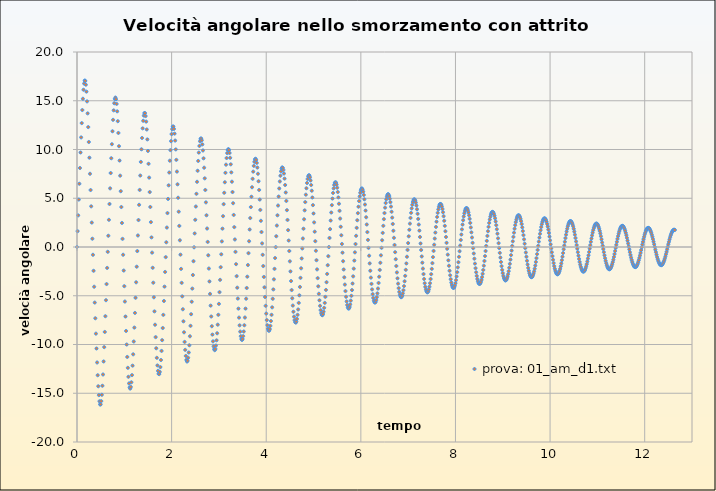
| Category | prova: 01_am_d1.txt |
|---|---|
| 0.0 | 0 |
| 0.0125 | 1.623 |
| 0.025 | 3.243 |
| 0.037500000000000006 | 4.865 |
| 0.05 | 6.487 |
| 0.0625 | 8.102 |
| 0.075 | 9.695 |
| 0.0875 | 11.242 |
| 0.09999999999999999 | 12.707 |
| 0.11249999999999999 | 14.046 |
| 0.12499999999999999 | 15.205 |
| 0.13749999999999998 | 16.129 |
| 0.15 | 16.766 |
| 0.1625 | 17.075 |
| 0.17500000000000002 | 17.036 |
| 0.18750000000000003 | 16.647 |
| 0.20000000000000004 | 15.934 |
| 0.21250000000000005 | 14.936 |
| 0.22500000000000006 | 13.705 |
| 0.23750000000000007 | 12.299 |
| 0.25000000000000006 | 10.769 |
| 0.26250000000000007 | 9.161 |
| 0.2750000000000001 | 7.51 |
| 0.2875000000000001 | 5.841 |
| 0.3000000000000001 | 4.17 |
| 0.3125000000000001 | 2.505 |
| 0.3250000000000001 | 0.849 |
| 0.33750000000000013 | -0.799 |
| 0.35000000000000014 | -2.441 |
| 0.36250000000000016 | -4.075 |
| 0.37500000000000017 | -5.701 |
| 0.3875000000000002 | -7.309 |
| 0.4000000000000002 | -8.887 |
| 0.4125000000000002 | -10.409 |
| 0.4250000000000002 | -11.844 |
| 0.4375000000000002 | -13.152 |
| 0.45000000000000023 | -14.284 |
| 0.46250000000000024 | -15.19 |
| 0.47500000000000026 | -15.824 |
| 0.48750000000000027 | -16.149 |
| 0.5000000000000002 | -16.144 |
| 0.5125000000000002 | -15.808 |
| 0.5250000000000001 | -15.159 |
| 0.5375000000000001 | -14.234 |
| 0.55 | -13.077 |
| 0.5625 | -11.74 |
| 0.575 | -10.27 |
| 0.5874999999999999 | -8.712 |
| 0.5999999999999999 | -7.099 |
| 0.6124999999999998 | -5.456 |
| 0.6249999999999998 | -3.801 |
| 0.6374999999999997 | -2.145 |
| 0.6499999999999997 | -0.493 |
| 0.6624999999999996 | 1.152 |
| 0.6749999999999996 | 2.788 |
| 0.6874999999999996 | 4.411 |
| 0.6999999999999995 | 6.014 |
| 0.7124999999999995 | 7.585 |
| 0.7249999999999994 | 9.104 |
| 0.7374999999999994 | 10.544 |
| 0.7499999999999993 | 11.871 |
| 0.7624999999999993 | 13.042 |
| 0.7749999999999992 | 14.015 |
| 0.7874999999999992 | 14.743 |
| 0.7999999999999992 | 15.19 |
| 0.8124999999999991 | 15.331 |
| 0.8249999999999991 | 15.156 |
| 0.837499999999999 | 14.675 |
| 0.849999999999999 | 13.912 |
| 0.8624999999999989 | 12.905 |
| 0.8749999999999989 | 11.698 |
| 0.8874999999999988 | 10.337 |
| 0.8999999999999988 | 8.865 |
| 0.9124999999999988 | 7.316 |
| 0.9249999999999987 | 5.721 |
| 0.9374999999999987 | 4.1 |
| 0.9499999999999986 | 2.468 |
| 0.9624999999999986 | 0.834 |
| 0.9749999999999985 | -0.796 |
| 0.9874999999999985 | -2.415 |
| 0.9999999999999984 | -4.018 |
| 1.0124999999999984 | -5.594 |
| 1.0249999999999984 | -7.132 |
| 1.0374999999999983 | -8.61 |
| 1.0499999999999983 | -10.003 |
| 1.0624999999999982 | -11.277 |
| 1.0749999999999982 | -12.394 |
| 1.0874999999999981 | -13.313 |
| 1.099999999999998 | -13.994 |
| 1.112499999999998 | -14.406 |
| 1.124999999999998 | -14.526 |
| 1.137499999999998 | -14.346 |
| 1.149999999999998 | -13.877 |
| 1.1624999999999979 | -13.14 |
| 1.1749999999999978 | -12.17 |
| 1.1874999999999978 | -11.008 |
| 1.1999999999999977 | -9.694 |
| 1.2124999999999977 | -8.267 |
| 1.2249999999999976 | -6.763 |
| 1.2374999999999976 | -5.207 |
| 1.2499999999999976 | -3.621 |
| 1.2624999999999975 | -2.021 |
| 1.2749999999999975 | -0.418 |
| 1.2874999999999974 | 1.181 |
| 1.2999999999999974 | 2.766 |
| 1.3124999999999973 | 4.327 |
| 1.3249999999999973 | 5.854 |
| 1.3374999999999972 | 7.328 |
| 1.3499999999999972 | 8.727 |
| 1.3624999999999972 | 10.023 |
| 1.3749999999999971 | 11.183 |
| 1.387499999999997 | 12.169 |
| 1.399999999999997 | 12.945 |
| 1.412499999999997 | 13.478 |
| 1.424999999999997 | 13.743 |
| 1.437499999999997 | 13.726 |
| 1.4499999999999968 | 13.427 |
| 1.4624999999999968 | 12.861 |
| 1.4749999999999968 | 12.053 |
| 1.4874999999999967 | 11.037 |
| 1.4999999999999967 | 9.852 |
| 1.5124999999999966 | 8.533 |
| 1.5249999999999966 | 7.118 |
| 1.5374999999999965 | 5.633 |
| 1.5499999999999965 | 4.105 |
| 1.5624999999999964 | 2.551 |
| 1.5749999999999964 | 0.987 |
| 1.5874999999999964 | -0.578 |
| 1.5999999999999963 | -2.131 |
| 1.6124999999999963 | -3.662 |
| 1.6249999999999962 | -5.157 |
| 1.6374999999999962 | -6.601 |
| 1.6499999999999961 | -7.972 |
| 1.662499999999996 | -9.244 |
| 1.674999999999996 | -10.386 |
| 1.687499999999996 | -11.365 |
| 1.699999999999996 | -12.147 |
| 1.712499999999996 | -12.701 |
| 1.7249999999999959 | -13.003 |
| 1.7374999999999958 | -13.039 |
| 1.7499999999999958 | -12.807 |
| 1.7624999999999957 | -12.318 |
| 1.7749999999999957 | -11.592 |
| 1.7874999999999956 | -10.659 |
| 1.7999999999999956 | -9.553 |
| 1.8124999999999956 | -8.31 |
| 1.8249999999999955 | -6.962 |
| 1.8374999999999955 | -5.539 |
| 1.8499999999999954 | -4.064 |
| 1.8624999999999954 | -2.559 |
| 1.8749999999999953 | -1.039 |
| 1.8874999999999953 | 0.483 |
| 1.8999999999999952 | 1.993 |
| 1.9124999999999952 | 3.481 |
| 1.9249999999999952 | 4.93 |
| 1.9374999999999951 | 6.323 |
| 1.949999999999995 | 7.639 |
| 1.962499999999995 | 8.853 |
| 1.974999999999995 | 9.935 |
| 1.987499999999995 | 10.854 |
| 1.999999999999995 | 11.579 |
| 2.012499999999995 | 12.084 |
| 2.024999999999995 | 12.348 |
| 2.037499999999995 | 12.358 |
| 2.0499999999999954 | 12.114 |
| 2.0624999999999956 | 11.626 |
| 2.0749999999999957 | 10.916 |
| 2.087499999999996 | 10.009 |
| 2.099999999999996 | 8.938 |
| 2.1124999999999963 | 7.735 |
| 2.1249999999999964 | 6.43 |
| 2.1374999999999966 | 5.051 |
| 2.149999999999997 | 3.622 |
| 2.162499999999997 | 2.162 |
| 2.174999999999997 | 0.688 |
| 2.1874999999999973 | -0.786 |
| 2.1999999999999975 | -2.245 |
| 2.2124999999999977 | -3.676 |
| 2.224999999999998 | -5.063 |
| 2.237499999999998 | -6.386 |
| 2.2499999999999982 | -7.622 |
| 2.2624999999999984 | -8.748 |
| 2.2749999999999986 | -9.734 |
| 2.2874999999999988 | -10.551 |
| 2.299999999999999 | -11.173 |
| 2.312499999999999 | -11.577 |
| 2.3249999999999993 | -11.745 |
| 2.3374999999999995 | -11.672 |
| 2.3499999999999996 | -11.36 |
| 2.3625 | -10.822 |
| 2.375 | -10.079 |
| 2.3875 | -9.157 |
| 2.4000000000000004 | -8.086 |
| 2.4125000000000005 | -6.895 |
| 2.4250000000000007 | -5.614 |
| 2.437500000000001 | -4.266 |
| 2.450000000000001 | -2.874 |
| 2.4625000000000012 | -1.456 |
| 2.4750000000000014 | -0.03 |
| 2.4875000000000016 | 1.39 |
| 2.5000000000000018 | 2.789 |
| 2.512500000000002 | 4.15 |
| 2.525000000000002 | 5.456 |
| 2.5375000000000023 | 6.687 |
| 2.5500000000000025 | 7.819 |
| 2.5625000000000027 | 8.826 |
| 2.575000000000003 | 9.683 |
| 2.587500000000003 | 10.362 |
| 2.600000000000003 | 10.841 |
| 2.6125000000000034 | 11.102 |
| 2.6250000000000036 | 11.135 |
| 2.6375000000000037 | 10.94 |
| 2.650000000000004 | 10.523 |
| 2.662500000000004 | 9.901 |
| 2.6750000000000043 | 9.095 |
| 2.6875000000000044 | 8.133 |
| 2.7000000000000046 | 7.041 |
| 2.712500000000005 | 5.847 |
| 2.725000000000005 | 4.577 |
| 2.737500000000005 | 3.253 |
| 2.7500000000000053 | 1.895 |
| 2.7625000000000055 | 0.522 |
| 2.7750000000000057 | -0.852 |
| 2.787500000000006 | -2.209 |
| 2.800000000000006 | -3.533 |
| 2.812500000000006 | -4.808 |
| 2.8250000000000064 | -6.014 |
| 2.8375000000000066 | -7.128 |
| 2.8500000000000068 | -8.126 |
| 2.862500000000007 | -8.985 |
| 2.875000000000007 | -9.679 |
| 2.8875000000000073 | -10.188 |
| 2.9000000000000075 | -10.492 |
| 2.9125000000000076 | -10.582 |
| 2.925000000000008 | -10.453 |
| 2.937500000000008 | -10.112 |
| 2.950000000000008 | -9.571 |
| 2.9625000000000083 | -8.848 |
| 2.9750000000000085 | -7.967 |
| 2.9875000000000087 | -6.954 |
| 3.000000000000009 | -5.834 |
| 3.012500000000009 | -4.632 |
| 3.0250000000000092 | -3.371 |
| 3.0375000000000094 | -2.071 |
| 3.0500000000000096 | -0.751 |
| 3.0625000000000098 | 0.572 |
| 3.07500000000001 | 1.882 |
| 3.08750000000001 | 3.162 |
| 3.1000000000000103 | 4.395 |
| 3.1125000000000105 | 5.561 |
| 3.1250000000000107 | 6.64 |
| 3.137500000000011 | 7.609 |
| 3.150000000000011 | 8.444 |
| 3.162500000000011 | 9.124 |
| 3.1750000000000114 | 9.628 |
| 3.1875000000000115 | 9.938 |
| 3.2000000000000117 | 10.046 |
| 3.212500000000012 | 9.946 |
| 3.225000000000012 | 9.643 |
| 3.2375000000000123 | 9.148 |
| 3.2500000000000124 | 8.478 |
| 3.2625000000000126 | 7.653 |
| 3.275000000000013 | 6.698 |
| 3.287500000000013 | 5.636 |
| 3.300000000000013 | 4.491 |
| 3.3125000000000133 | 3.286 |
| 3.3250000000000135 | 2.04 |
| 3.3375000000000137 | 0.772 |
| 3.350000000000014 | -0.499 |
| 3.362500000000014 | -1.759 |
| 3.375000000000014 | -2.989 |
| 3.3875000000000144 | -4.172 |
| 3.4000000000000146 | -5.289 |
| 3.4125000000000147 | -6.319 |
| 3.425000000000015 | -7.242 |
| 3.437500000000015 | -8.036 |
| 3.4500000000000153 | -8.679 |
| 3.4625000000000155 | -9.152 |
| 3.4750000000000156 | -9.442 |
| 3.487500000000016 | -9.538 |
| 3.500000000000016 | -9.437 |
| 3.512500000000016 | -9.144 |
| 3.5250000000000163 | -8.668 |
| 3.5375000000000165 | -8.025 |
| 3.5500000000000167 | -7.235 |
| 3.562500000000017 | -6.32 |
| 3.575000000000017 | -5.301 |
| 3.5875000000000172 | -4.203 |
| 3.6000000000000174 | -3.045 |
| 3.6125000000000176 | -1.849 |
| 3.6250000000000178 | -0.632 |
| 3.637500000000018 | 0.589 |
| 3.650000000000018 | 1.795 |
| 3.6625000000000183 | 2.971 |
| 3.6750000000000185 | 4.098 |
| 3.6875000000000187 | 5.157 |
| 3.700000000000019 | 6.129 |
| 3.712500000000019 | 6.993 |
| 3.725000000000019 | 7.73 |
| 3.7375000000000194 | 8.318 |
| 3.7500000000000195 | 8.743 |
| 3.7625000000000197 | 8.991 |
| 3.77500000000002 | 9.054 |
| 3.78750000000002 | 8.93 |
| 3.8000000000000203 | 8.625 |
| 3.8125000000000204 | 8.147 |
| 3.8250000000000206 | 7.513 |
| 3.837500000000021 | 6.741 |
| 3.850000000000021 | 5.85 |
| 3.862500000000021 | 4.864 |
| 3.8750000000000213 | 3.803 |
| 3.8875000000000215 | 2.687 |
| 3.9000000000000217 | 1.536 |
| 3.912500000000022 | 0.367 |
| 3.925000000000022 | -0.801 |
| 3.937500000000022 | -1.953 |
| 3.9500000000000224 | -3.07 |
| 3.9625000000000226 | -4.135 |
| 3.9750000000000227 | -5.129 |
| 3.987500000000023 | -6.034 |
| 4.000000000000023 | -6.83 |
| 4.012500000000023 | -7.497 |
| 4.0250000000000234 | -8.018 |
| 4.037500000000024 | -8.38 |
| 4.050000000000024 | -8.571 |
| 4.062500000000024 | -8.585 |
| 4.075000000000024 | -8.422 |
| 4.087500000000024 | -8.089 |
| 4.1000000000000245 | -7.595 |
| 4.112500000000025 | -6.955 |
| 4.125000000000025 | -6.188 |
| 4.137500000000025 | -5.313 |
| 4.150000000000025 | -4.35 |
| 4.162500000000025 | -3.319 |
| 4.175000000000026 | -2.24 |
| 4.187500000000026 | -1.132 |
| 4.200000000000026 | -0.011 |
| 4.212500000000026 | 1.105 |
| 4.225000000000026 | 2.199 |
| 4.2375000000000265 | 3.253 |
| 4.250000000000027 | 4.251 |
| 4.262500000000027 | 5.174 |
| 4.275000000000027 | 6.003 |
| 4.287500000000027 | 6.721 |
| 4.300000000000027 | 7.31 |
| 4.3125000000000275 | 7.754 |
| 4.325000000000028 | 8.041 |
| 4.337500000000028 | 8.164 |
| 4.350000000000028 | 8.118 |
| 4.362500000000028 | 7.906 |
| 4.375000000000028 | 7.534 |
| 4.387500000000029 | 7.014 |
| 4.400000000000029 | 6.36 |
| 4.412500000000029 | 5.59 |
| 4.425000000000029 | 4.723 |
| 4.437500000000029 | 3.778 |
| 4.4500000000000295 | 2.774 |
| 4.46250000000003 | 1.73 |
| 4.47500000000003 | 0.663 |
| 4.48750000000003 | -0.41 |
| 4.50000000000003 | -1.471 |
| 4.51250000000003 | -2.504 |
| 4.5250000000000306 | -3.491 |
| 4.537500000000031 | -4.417 |
| 4.550000000000031 | -5.261 |
| 4.562500000000031 | -6.009 |
| 4.575000000000031 | -6.641 |
| 4.587500000000031 | -7.143 |
| 4.600000000000032 | -7.502 |
| 4.612500000000032 | -7.708 |
| 4.625000000000032 | -7.755 |
| 4.637500000000032 | -7.642 |
| 4.650000000000032 | -7.374 |
| 4.6625000000000325 | -6.957 |
| 4.675000000000033 | -6.405 |
| 4.687500000000033 | -5.733 |
| 4.700000000000033 | -4.956 |
| 4.712500000000033 | -4.094 |
| 4.725000000000033 | -3.165 |
| 4.737500000000034 | -2.186 |
| 4.750000000000034 | -1.176 |
| 4.762500000000034 | -0.151 |
| 4.775000000000034 | 0.871 |
| 4.787500000000034 | 1.875 |
| 4.8000000000000345 | 2.843 |
| 4.812500000000035 | 3.759 |
| 4.825000000000035 | 4.606 |
| 4.837500000000035 | 5.367 |
| 4.850000000000035 | 6.025 |
| 4.862500000000035 | 6.566 |
| 4.8750000000000355 | 6.976 |
| 4.887500000000036 | 7.244 |
| 4.900000000000036 | 7.364 |
| 4.912500000000036 | 7.331 |
| 4.925000000000036 | 7.148 |
| 4.937500000000036 | 6.82 |
| 4.950000000000037 | 6.357 |
| 4.962500000000037 | 5.772 |
| 4.975000000000037 | 5.078 |
| 4.987500000000037 | 4.294 |
| 5.000000000000037 | 3.437 |
| 5.0125000000000375 | 2.523 |
| 5.025000000000038 | 1.57 |
| 5.037500000000038 | 0.596 |
| 5.050000000000038 | -0.384 |
| 5.062500000000038 | -1.353 |
| 5.075000000000038 | -2.295 |
| 5.0875000000000385 | -3.194 |
| 5.100000000000039 | -4.033 |
| 5.112500000000039 | -4.796 |
| 5.125000000000039 | -5.467 |
| 5.137500000000039 | -6.032 |
| 5.150000000000039 | -6.476 |
| 5.16250000000004 | -6.79 |
| 5.17500000000004 | -6.964 |
| 5.18750000000004 | -6.995 |
| 5.20000000000004 | -6.882 |
| 5.21250000000004 | -6.628 |
| 5.2250000000000405 | -6.242 |
| 5.237500000000041 | -5.733 |
| 5.250000000000041 | -5.114 |
| 5.262500000000041 | -4.402 |
| 5.275000000000041 | -3.612 |
| 5.287500000000041 | -2.761 |
| 5.300000000000042 | -1.865 |
| 5.312500000000042 | -0.941 |
| 5.325000000000042 | -0.005 |
| 5.337500000000042 | 0.926 |
| 5.350000000000042 | 1.837 |
| 5.3625000000000425 | 2.713 |
| 5.375000000000043 | 3.537 |
| 5.387500000000043 | 4.293 |
| 5.400000000000043 | 4.967 |
| 5.412500000000043 | 5.544 |
| 5.425000000000043 | 6.011 |
| 5.4375000000000435 | 6.356 |
| 5.450000000000044 | 6.571 |
| 5.462500000000044 | 6.651 |
| 5.475000000000044 | 6.594 |
| 5.487500000000044 | 6.401 |
| 5.500000000000044 | 6.079 |
| 5.512500000000045 | 5.637 |
| 5.525000000000045 | 5.085 |
| 5.537500000000045 | 4.438 |
| 5.550000000000045 | 3.71 |
| 5.562500000000045 | 2.918 |
| 5.5750000000000455 | 2.077 |
| 5.587500000000046 | 1.203 |
| 5.600000000000046 | 0.312 |
| 5.612500000000046 | -0.58 |
| 5.625000000000046 | -1.458 |
| 5.637500000000046 | -2.306 |
| 5.6500000000000465 | -3.11 |
| 5.662500000000047 | -3.854 |
| 5.675000000000047 | -4.523 |
| 5.687500000000047 | -5.103 |
| 5.700000000000047 | -5.582 |
| 5.712500000000047 | -5.948 |
| 5.725000000000048 | -6.192 |
| 5.737500000000048 | -6.309 |
| 5.750000000000048 | -6.296 |
| 5.762500000000048 | -6.153 |
| 5.775000000000048 | -5.886 |
| 5.7875000000000485 | -5.5 |
| 5.800000000000049 | -5.007 |
| 5.812500000000049 | -4.418 |
| 5.825000000000049 | -3.748 |
| 5.837500000000049 | -3.01 |
| 5.850000000000049 | -2.221 |
| 5.86250000000005 | -1.395 |
| 5.87500000000005 | -0.549 |
| 5.88750000000005 | 0.304 |
| 5.90000000000005 | 1.147 |
| 5.91250000000005 | 1.966 |
| 5.9250000000000504 | 2.746 |
| 5.937500000000051 | 3.472 |
| 5.950000000000051 | 4.13 |
| 5.962500000000051 | 4.707 |
| 5.975000000000051 | 5.19 |
| 5.987500000000051 | 5.568 |
| 6.0000000000000515 | 5.832 |
| 6.012500000000052 | 5.977 |
| 6.025000000000052 | 5.998 |
| 6.037500000000052 | 5.895 |
| 6.050000000000052 | 5.672 |
| 6.062500000000052 | 5.335 |
| 6.075000000000053 | 4.893 |
| 6.087500000000053 | 4.356 |
| 6.100000000000053 | 3.737 |
| 6.112500000000053 | 3.05 |
| 6.125000000000053 | 2.309 |
| 6.1375000000000535 | 1.53 |
| 6.150000000000054 | 0.726 |
| 6.162500000000054 | -0.087 |
| 6.175000000000054 | -0.894 |
| 6.187500000000054 | -1.682 |
| 6.200000000000054 | -2.436 |
| 6.2125000000000545 | -3.141 |
| 6.225000000000055 | -3.784 |
| 6.237500000000055 | -4.353 |
| 6.250000000000055 | -4.834 |
| 6.262500000000055 | -5.217 |
| 6.275000000000055 | -5.494 |
| 6.287500000000056 | -5.658 |
| 6.300000000000056 | -5.705 |
| 6.312500000000056 | -5.634 |
| 6.325000000000056 | -5.448 |
| 6.337500000000056 | -5.152 |
| 6.3500000000000565 | -4.753 |
| 6.362500000000057 | -4.262 |
| 6.375000000000057 | -3.689 |
| 6.387500000000057 | -3.049 |
| 6.400000000000057 | -2.353 |
| 6.412500000000057 | -1.618 |
| 6.4250000000000576 | -0.855 |
| 6.437500000000058 | -0.081 |
| 6.450000000000058 | 0.691 |
| 6.462500000000058 | 1.447 |
| 6.475000000000058 | 2.173 |
| 6.487500000000058 | 2.855 |
| 6.500000000000059 | 3.481 |
| 6.512500000000059 | 4.037 |
| 6.525000000000059 | 4.512 |
| 6.537500000000059 | 4.895 |
| 6.550000000000059 | 5.178 |
| 6.5625000000000595 | 5.355 |
| 6.57500000000006 | 5.421 |
| 6.58750000000006 | 5.375 |
| 6.60000000000006 | 5.219 |
| 6.61250000000006 | 4.957 |
| 6.62500000000006 | 4.596 |
| 6.637500000000061 | 4.145 |
| 6.650000000000061 | 3.614 |
| 6.662500000000061 | 3.015 |
| 6.675000000000061 | 2.362 |
| 6.687500000000061 | 1.667 |
| 6.7000000000000615 | 0.944 |
| 6.712500000000062 | 0.207 |
| 6.725000000000062 | -0.53 |
| 6.737500000000062 | -1.254 |
| 6.750000000000062 | -1.952 |
| 6.762500000000062 | -2.609 |
| 6.7750000000000625 | -3.215 |
| 6.787500000000063 | -3.755 |
| 6.800000000000063 | -4.22 |
| 6.812500000000063 | -4.599 |
| 6.825000000000063 | -4.884 |
| 6.837500000000063 | -5.069 |
| 6.850000000000064 | -5.148 |
| 6.862500000000064 | -5.122 |
| 6.875000000000064 | -4.99 |
| 6.887500000000064 | -4.757 |
| 6.900000000000064 | -4.428 |
| 6.9125000000000645 | -4.012 |
| 6.925000000000065 | -3.518 |
| 6.937500000000065 | -2.957 |
| 6.950000000000065 | -2.342 |
| 6.962500000000065 | -1.686 |
| 6.975000000000065 | -1 |
| 6.9875000000000655 | -0.299 |
| 7.000000000000066 | 0.404 |
| 7.012500000000066 | 1.097 |
| 7.025000000000066 | 1.765 |
| 7.037500000000066 | 2.398 |
| 7.050000000000066 | 2.981 |
| 7.062500000000067 | 3.505 |
| 7.075000000000067 | 3.957 |
| 7.087500000000067 | 4.329 |
| 7.100000000000067 | 4.612 |
| 7.112500000000067 | 4.8 |
| 7.1250000000000675 | 4.888 |
| 7.137500000000068 | 4.876 |
| 7.150000000000068 | 4.764 |
| 7.162500000000068 | 4.554 |
| 7.175000000000068 | 4.253 |
| 7.187500000000068 | 3.867 |
| 7.200000000000069 | 3.406 |
| 7.212500000000069 | 2.88 |
| 7.225000000000069 | 2.301 |
| 7.237500000000069 | 1.68 |
| 7.250000000000069 | 1.03 |
| 7.2625000000000695 | 0.363 |
| 7.27500000000007 | -0.307 |
| 7.28750000000007 | -0.969 |
| 7.30000000000007 | -1.609 |
| 7.31250000000007 | -2.215 |
| 7.32500000000007 | -2.777 |
| 7.3375000000000705 | -3.281 |
| 7.350000000000071 | -3.719 |
| 7.362500000000071 | -4.081 |
| 7.375000000000071 | -4.359 |
| 7.387500000000071 | -4.547 |
| 7.400000000000071 | -4.641 |
| 7.412500000000072 | -4.64 |
| 7.425000000000072 | -4.543 |
| 7.437500000000072 | -4.353 |
| 7.450000000000072 | -4.075 |
| 7.462500000000072 | -3.716 |
| 7.4750000000000725 | -3.284 |
| 7.487500000000073 | -2.79 |
| 7.500000000000073 | -2.243 |
| 7.512500000000073 | -1.655 |
| 7.525000000000073 | -1.038 |
| 7.537500000000073 | -0.404 |
| 7.5500000000000735 | 0.235 |
| 7.562500000000074 | 0.866 |
| 7.575000000000074 | 1.478 |
| 7.587500000000074 | 2.059 |
| 7.600000000000074 | 2.597 |
| 7.612500000000074 | 3.082 |
| 7.625000000000075 | 3.504 |
| 7.637500000000075 | 3.854 |
| 7.650000000000075 | 4.125 |
| 7.662500000000075 | 4.311 |
| 7.675000000000075 | 4.407 |
| 7.6875000000000755 | 4.413 |
| 7.700000000000076 | 4.328 |
| 7.712500000000076 | 4.154 |
| 7.725000000000076 | 3.896 |
| 7.737500000000076 | 3.561 |
| 7.750000000000076 | 3.155 |
| 7.762500000000077 | 2.689 |
| 7.775000000000077 | 2.172 |
| 7.787500000000077 | 1.614 |
| 7.800000000000077 | 1.029 |
| 7.812500000000077 | 0.426 |
| 7.8250000000000774 | -0.182 |
| 7.837500000000078 | -0.784 |
| 7.850000000000078 | -1.368 |
| 7.862500000000078 | -1.923 |
| 7.875000000000078 | -2.438 |
| 7.887500000000078 | -2.903 |
| 7.9000000000000785 | -3.308 |
| 7.912500000000079 | -3.646 |
| 7.925000000000079 | -3.908 |
| 7.937500000000079 | -4.089 |
| 7.950000000000079 | -4.186 |
| 7.962500000000079 | -4.196 |
| 7.97500000000008 | -4.12 |
| 7.98750000000008 | -3.959 |
| 8.00000000000008 | -3.719 |
| 8.01250000000008 | -3.404 |
| 8.025000000000079 | -3.022 |
| 8.037500000000078 | -2.581 |
| 8.050000000000077 | -2.091 |
| 8.062500000000076 | -1.563 |
| 8.075000000000076 | -1.006 |
| 8.087500000000075 | -0.433 |
| 8.100000000000074 | 0.146 |
| 8.112500000000074 | 0.72 |
| 8.125000000000073 | 1.277 |
| 8.137500000000072 | 1.806 |
| 8.150000000000071 | 2.298 |
| 8.16250000000007 | 2.743 |
| 8.17500000000007 | 3.13 |
| 8.18750000000007 | 3.454 |
| 8.200000000000069 | 3.706 |
| 8.212500000000068 | 3.881 |
| 8.225000000000067 | 3.976 |
| 8.237500000000066 | 3.989 |
| 8.250000000000066 | 3.92 |
| 8.262500000000065 | 3.77 |
| 8.275000000000064 | 3.544 |
| 8.287500000000064 | 3.247 |
| 8.300000000000063 | 2.886 |
| 8.312500000000062 | 2.469 |
| 8.325000000000061 | 2.004 |
| 8.33750000000006 | 1.502 |
| 8.35000000000006 | 0.974 |
| 8.36250000000006 | 0.428 |
| 8.375000000000059 | -0.123 |
| 8.387500000000058 | -0.669 |
| 8.400000000000057 | -1.2 |
| 8.412500000000056 | -1.705 |
| 8.425000000000056 | -2.174 |
| 8.437500000000055 | -2.598 |
| 8.450000000000054 | -2.968 |
| 8.462500000000054 | -3.277 |
| 8.475000000000053 | -3.518 |
| 8.487500000000052 | -3.686 |
| 8.500000000000052 | -3.778 |
| 8.51250000000005 | -3.792 |
| 8.52500000000005 | -3.727 |
| 8.53750000000005 | -3.587 |
| 8.550000000000049 | -3.373 |
| 8.562500000000048 | -3.092 |
| 8.575000000000047 | -2.75 |
| 8.587500000000047 | -2.354 |
| 8.600000000000046 | -1.913 |
| 8.612500000000045 | -1.436 |
| 8.625000000000044 | -0.933 |
| 8.637500000000044 | -0.414 |
| 8.650000000000043 | 0.11 |
| 8.662500000000042 | 0.63 |
| 8.675000000000042 | 1.136 |
| 8.68750000000004 | 1.616 |
| 8.70000000000004 | 2.063 |
| 8.71250000000004 | 2.467 |
| 8.725000000000039 | 2.819 |
| 8.737500000000038 | 3.113 |
| 8.750000000000037 | 3.342 |
| 8.762500000000037 | 3.503 |
| 8.775000000000036 | 3.59 |
| 8.787500000000035 | 3.604 |
| 8.800000000000034 | 3.543 |
| 8.812500000000034 | 3.41 |
| 8.825000000000033 | 3.207 |
| 8.837500000000032 | 2.94 |
| 8.850000000000032 | 2.615 |
| 8.862500000000031 | 2.239 |
| 8.87500000000003 | 1.819 |
| 8.88750000000003 | 1.365 |
| 8.900000000000029 | 0.887 |
| 8.912500000000028 | 0.393 |
| 8.925000000000027 | -0.106 |
| 8.937500000000027 | -0.601 |
| 8.950000000000026 | -1.082 |
| 8.962500000000025 | -1.539 |
| 8.975000000000025 | -1.964 |
| 8.987500000000024 | -2.347 |
| 9.000000000000023 | -2.682 |
| 9.012500000000022 | -2.961 |
| 9.025000000000022 | -3.179 |
| 9.037500000000021 | -3.33 |
| 9.05000000000002 | -3.413 |
| 9.06250000000002 | -3.425 |
| 9.075000000000019 | -3.367 |
| 9.087500000000018 | -3.239 |
| 9.100000000000017 | -3.046 |
| 9.112500000000017 | -2.792 |
| 9.125000000000016 | -2.482 |
| 9.137500000000015 | -2.123 |
| 9.150000000000015 | -1.724 |
| 9.162500000000014 | -1.292 |
| 9.175000000000013 | -0.837 |
| 9.187500000000012 | -0.367 |
| 9.200000000000012 | 0.109 |
| 9.212500000000011 | 0.579 |
| 9.22500000000001 | 1.036 |
| 9.23750000000001 | 1.471 |
| 9.250000000000009 | 1.874 |
| 9.262500000000008 | 2.238 |
| 9.275000000000007 | 2.555 |
| 9.287500000000007 | 2.819 |
| 9.300000000000006 | 3.025 |
| 9.312500000000005 | 3.168 |
| 9.325000000000005 | 3.245 |
| 9.337500000000004 | 3.255 |
| 9.350000000000003 | 3.198 |
| 9.362500000000002 | 3.075 |
| 9.375000000000002 | 2.891 |
| 9.387500000000001 | 2.647 |
| 9.4 | 2.352 |
| 9.4125 | 2.01 |
| 9.424999999999999 | 1.629 |
| 9.437499999999998 | 1.218 |
| 9.449999999999998 | 0.784 |
| 9.462499999999997 | 0.336 |
| 9.474999999999996 | -0.116 |
| 9.487499999999995 | -0.563 |
| 9.499999999999995 | -0.998 |
| 9.512499999999994 | -1.41 |
| 9.524999999999993 | -1.793 |
| 9.537499999999993 | -2.138 |
| 9.549999999999992 | -2.438 |
| 9.562499999999991 | -2.687 |
| 9.57499999999999 | -2.881 |
| 9.58749999999999 | -3.014 |
| 9.599999999999989 | -3.085 |
| 9.612499999999988 | -3.093 |
| 9.624999999999988 | -3.037 |
| 9.637499999999987 | -2.918 |
| 9.649999999999986 | -2.74 |
| 9.662499999999985 | -2.508 |
| 9.674999999999985 | -2.225 |
| 9.687499999999984 | -1.898 |
| 9.699999999999983 | -1.535 |
| 9.712499999999983 | -1.143 |
| 9.724999999999982 | -0.729 |
| 9.737499999999981 | -0.303 |
| 9.74999999999998 | 0.127 |
| 9.76249999999998 | 0.552 |
| 9.774999999999979 | 0.965 |
| 9.787499999999978 | 1.356 |
| 9.799999999999978 | 1.719 |
| 9.812499999999977 | 2.045 |
| 9.824999999999976 | 2.328 |
| 9.837499999999975 | 2.563 |
| 9.849999999999975 | 2.745 |
| 9.862499999999974 | 2.869 |
| 9.874999999999973 | 2.934 |
| 9.887499999999973 | 2.939 |
| 9.899999999999972 | 2.883 |
| 9.912499999999971 | 2.767 |
| 9.92499999999997 | 2.596 |
| 9.93749999999997 | 2.372 |
| 9.949999999999969 | 2.102 |
| 9.962499999999968 | 1.789 |
| 9.974999999999968 | 1.442 |
| 9.987499999999967 | 1.068 |
| 9.999999999999966 | 0.674 |
| 10.012499999999966 | 0.269 |
| 10.024999999999965 | -0.14 |
| 10.037499999999964 | -0.545 |
| 10.049999999999963 | -0.936 |
| 10.062499999999963 | -1.307 |
| 10.074999999999962 | -1.651 |
| 10.087499999999961 | -1.959 |
| 10.09999999999996 | -2.226 |
| 10.11249999999996 | -2.447 |
| 10.12499999999996 | -2.617 |
| 10.137499999999958 | -2.732 |
| 10.149999999999958 | -2.791 |
| 10.162499999999957 | -2.792 |
| 10.174999999999956 | -2.735 |
| 10.187499999999956 | -2.623 |
| 10.199999999999955 | -2.457 |
| 10.212499999999954 | -2.242 |
| 10.224999999999953 | -1.983 |
| 10.237499999999953 | -1.684 |
| 10.249999999999952 | -1.352 |
| 10.262499999999951 | -0.995 |
| 10.27499999999995 | -0.619 |
| 10.28749999999995 | -0.233 |
| 10.29999999999995 | 0.156 |
| 10.312499999999948 | 0.54 |
| 10.324999999999948 | 0.911 |
| 10.337499999999947 | 1.263 |
| 10.349999999999946 | 1.588 |
| 10.362499999999946 | 1.879 |
| 10.374999999999945 | 2.13 |
| 10.387499999999944 | 2.337 |
| 10.399999999999944 | 2.495 |
| 10.412499999999943 | 2.602 |
| 10.424999999999942 | 2.654 |
| 10.437499999999941 | 2.652 |
| 10.44999999999994 | 2.595 |
| 10.46249999999994 | 2.485 |
| 10.47499999999994 | 2.325 |
| 10.487499999999939 | 2.117 |
| 10.499999999999938 | 1.868 |
| 10.512499999999937 | 1.581 |
| 10.524999999999936 | 1.265 |
| 10.537499999999936 | 0.923 |
| 10.549999999999935 | 0.565 |
| 10.562499999999934 | 0.198 |
| 10.574999999999934 | -0.172 |
| 10.587499999999933 | -0.537 |
| 10.599999999999932 | -0.889 |
| 10.612499999999931 | -1.222 |
| 10.62499999999993 | -1.529 |
| 10.63749999999993 | -1.803 |
| 10.64999999999993 | -2.04 |
| 10.662499999999929 | -2.233 |
| 10.674999999999928 | -2.38 |
| 10.687499999999927 | -2.478 |
| 10.699999999999926 | -2.524 |
| 10.712499999999926 | -2.519 |
| 10.724999999999925 | -2.461 |
| 10.737499999999924 | -2.353 |
| 10.749999999999924 | -2.197 |
| 10.762499999999923 | -1.997 |
| 10.774999999999922 | -1.757 |
| 10.787499999999921 | -1.483 |
| 10.79999999999992 | -1.18 |
| 10.81249999999992 | -0.854 |
| 10.82499999999992 | -0.513 |
| 10.837499999999919 | -0.163 |
| 10.849999999999918 | 0.189 |
| 10.862499999999917 | 0.536 |
| 10.874999999999917 | 0.87 |
| 10.887499999999916 | 1.184 |
| 10.899999999999915 | 1.474 |
| 10.912499999999914 | 1.732 |
| 10.924999999999914 | 1.954 |
| 10.937499999999913 | 2.135 |
| 10.949999999999912 | 2.271 |
| 10.962499999999912 | 2.361 |
| 10.97499999999991 | 2.401 |
| 10.98749999999991 | 2.391 |
| 10.99999999999991 | 2.333 |
| 11.012499999999909 | 2.227 |
| 11.024999999999908 | 2.075 |
| 11.037499999999907 | 1.882 |
| 11.049999999999907 | 1.652 |
| 11.062499999999906 | 1.388 |
| 11.074999999999905 | 1.098 |
| 11.087499999999904 | 0.787 |
| 11.099999999999904 | 0.461 |
| 11.112499999999903 | 0.128 |
| 11.124999999999902 | -0.206 |
| 11.137499999999902 | -0.535 |
| 11.1499999999999 | -0.851 |
| 11.1624999999999 | -1.149 |
| 11.1749999999999 | -1.422 |
| 11.187499999999899 | -1.665 |
| 11.199999999999898 | -1.873 |
| 11.212499999999897 | -2.042 |
| 11.224999999999897 | -2.168 |
| 11.237499999999896 | -2.249 |
| 11.249999999999895 | -2.283 |
| 11.262499999999894 | -2.27 |
| 11.274999999999894 | -2.211 |
| 11.287499999999893 | -2.106 |
| 11.299999999999892 | -1.959 |
| 11.312499999999892 | -1.772 |
| 11.324999999999891 | -1.55 |
| 11.33749999999989 | -1.298 |
| 11.34999999999989 | -1.02 |
| 11.362499999999889 | -0.723 |
| 11.374999999999888 | -0.412 |
| 11.387499999999887 | -0.095 |
| 11.399999999999887 | 0.223 |
| 11.412499999999886 | 0.535 |
| 11.424999999999885 | 0.834 |
| 11.437499999999885 | 1.116 |
| 11.449999999999884 | 1.373 |
| 11.462499999999883 | 1.601 |
| 11.474999999999882 | 1.796 |
| 11.487499999999882 | 1.953 |
| 11.499999999999881 | 2.069 |
| 11.51249999999988 | 2.142 |
| 11.52499999999988 | 2.171 |
| 11.537499999999879 | 2.155 |
| 11.549999999999878 | 2.095 |
| 11.562499999999877 | 1.992 |
| 11.574999999999877 | 1.848 |
| 11.587499999999876 | 1.667 |
| 11.599999999999875 | 1.454 |
| 11.612499999999875 | 1.211 |
| 11.624999999999874 | 0.945 |
| 11.637499999999873 | 0.661 |
| 11.649999999999872 | 0.365 |
| 11.662499999999872 | 0.063 |
| 11.674999999999871 | -0.239 |
| 11.68749999999987 | -0.535 |
| 11.69999999999987 | -0.818 |
| 11.712499999999869 | -1.084 |
| 11.724999999999868 | -1.326 |
| 11.737499999999867 | -1.541 |
| 11.749999999999867 | -1.722 |
| 11.762499999999866 | -1.868 |
| 11.774999999999865 | -1.975 |
| 11.787499999999865 | -2.04 |
| 11.799999999999864 | -2.064 |
| 11.812499999999863 | -2.045 |
| 11.824999999999863 | -1.984 |
| 11.837499999999862 | -1.882 |
| 11.849999999999861 | -1.742 |
| 11.86249999999986 | -1.567 |
| 11.87499999999986 | -1.361 |
| 11.887499999999859 | -1.128 |
| 11.899999999999858 | -0.874 |
| 11.912499999999858 | -0.602 |
| 11.924999999999857 | -0.32 |
| 11.937499999999856 | -0.032 |
| 11.949999999999855 | 0.254 |
| 11.962499999999855 | 0.535 |
| 11.974999999999854 | 0.803 |
| 11.987499999999853 | 1.054 |
| 11.999999999999853 | 1.282 |
| 12.012499999999852 | 1.483 |
| 12.024999999999851 | 1.652 |
| 12.03749999999985 | 1.787 |
| 12.04999999999985 | 1.885 |
| 12.062499999999849 | 1.944 |
| 12.074999999999848 | 1.962 |
| 12.087499999999848 | 1.94 |
| 12.099999999999847 | 1.878 |
| 12.112499999999846 | 1.778 |
| 12.124999999999845 | 1.641 |
| 12.137499999999845 | 1.472 |
| 12.149999999999844 | 1.273 |
| 12.162499999999843 | 1.05 |
| 12.174999999999843 | 0.806 |
| 12.187499999999842 | 0.546 |
| 12.199999999999841 | 0.277 |
| 12.21249999999984 | 0.004 |
| 12.22499999999984 | -0.269 |
| 12.237499999999839 | -0.534 |
| 12.249999999999838 | -0.788 |
| 12.262499999999838 | -1.024 |
| 12.274999999999837 | -1.239 |
| 12.287499999999836 | -1.427 |
| 12.299999999999836 | -1.585 |
| 12.312499999999835 | -1.71 |
| 12.324999999999834 | -1.799 |
| 12.337499999999833 | -1.851 |
| 12.349999999999833 | -1.864 |
| 12.362499999999832 | -1.84 |
| 12.374999999999831 | -1.777 |
| 12.38749999999983 | -1.678 |
| 12.39999999999983 | -1.545 |
| 12.41249999999983 | -1.381 |
| 12.424999999999828 | -1.19 |
| 12.437499999999828 | -0.975 |
| 12.449999999999827 | -0.741 |
| 12.462499999999826 | -0.494 |
| 12.474999999999826 | -0.237 |
| 12.487499999999825 | 0.023 |
| 12.499999999999824 | 0.282 |
| 12.512499999999823 | 0.534 |
| 12.524999999999823 | 0.773 |
| 12.537499999999822 | 0.996 |
| 12.549999999999821 | 1.197 |
| 12.56249999999982 | 1.373 |
| 12.57499999999982 | 1.521 |
| 12.58749999999982 | 1.636 |
| 12.599999999999818 | 1.717 |
| 12.612499999999818 | 1.762 |
| 12.624999999999817 | 1.771 |
| 12.637499999999816 | 1.744 |